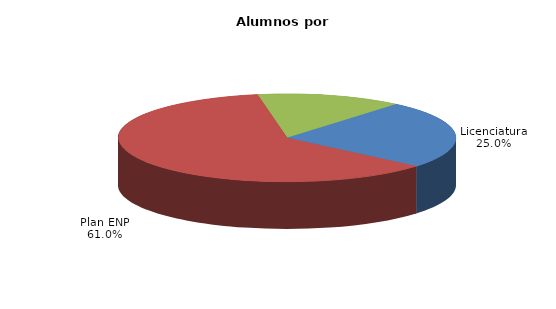
| Category | Series 0 |
|---|---|
| Licenciatura | 18954 |
| Plan ENP | 46192 |
| Plan CCH | 10530 |